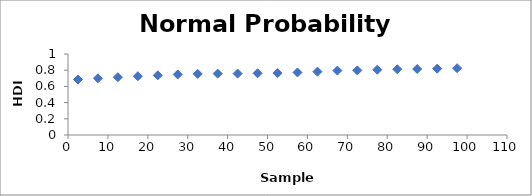
| Category | Series 0 |
|---|---|
| 2.5 | 0.685 |
| 7.5 | 0.7 |
| 12.5 | 0.714 |
| 17.5 | 0.726 |
| 22.5 | 0.737 |
| 27.5 | 0.747 |
| 32.5 | 0.754 |
| 37.5 | 0.758 |
| 42.5 | 0.758 |
| 47.5 | 0.762 |
| 52.5 | 0.764 |
| 57.5 | 0.772 |
| 62.5 | 0.782 |
| 67.5 | 0.795 |
| 72.5 | 0.798 |
| 77.5 | 0.806 |
| 82.5 | 0.812 |
| 87.5 | 0.815 |
| 92.5 | 0.819 |
| 97.5 | 0.825 |